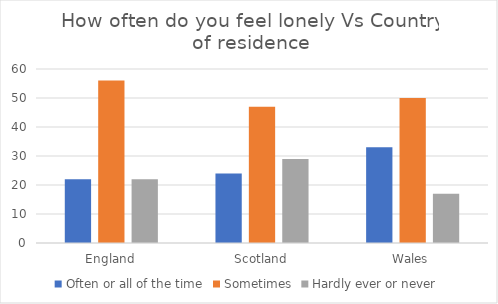
| Category | Often or all of the time | Sometimes | Hardly ever or never |
|---|---|---|---|
| England | 22 | 56 | 22 |
| Scotland | 24 | 47 | 29 |
| Wales | 33 | 50 | 17 |